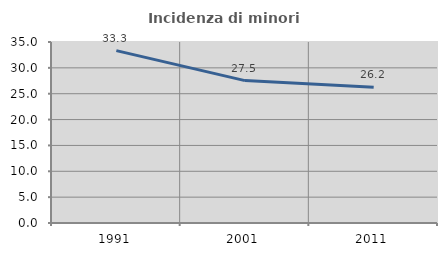
| Category | Incidenza di minori stranieri |
|---|---|
| 1991.0 | 33.333 |
| 2001.0 | 27.536 |
| 2011.0 | 26.241 |